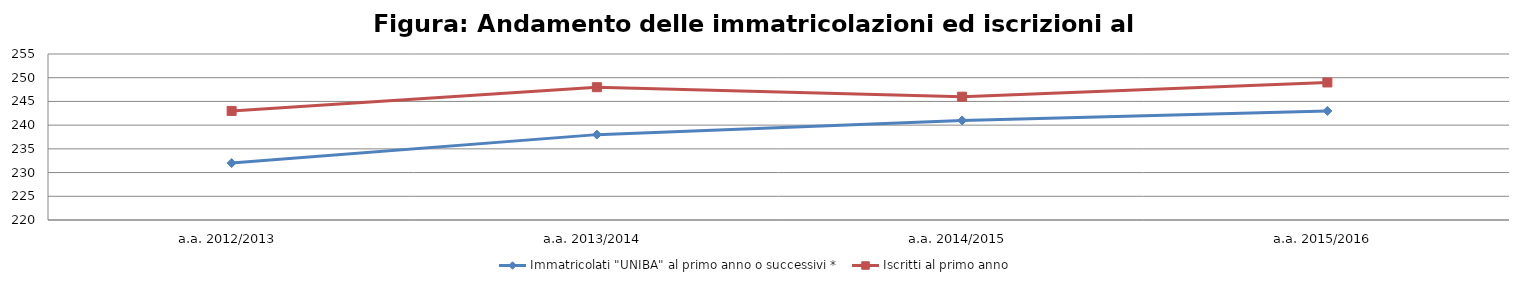
| Category | Immatricolati "UNIBA" al primo anno o successivi * | Iscritti al primo anno  |
|---|---|---|
| a.a. 2012/2013 | 232 | 243 |
| a.a. 2013/2014 | 238 | 248 |
| a.a. 2014/2015 | 241 | 246 |
| a.a. 2015/2016 | 243 | 249 |